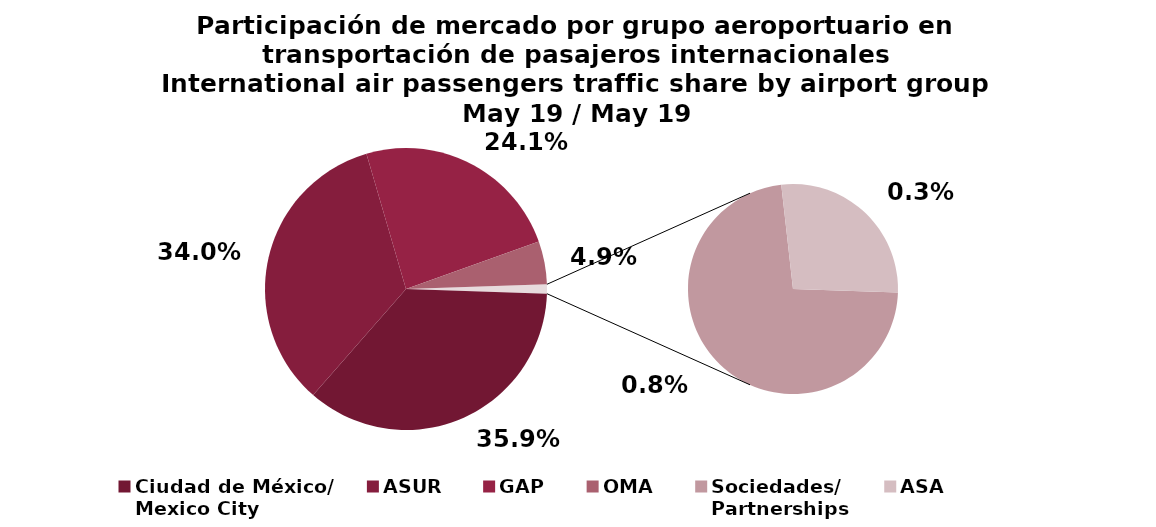
| Category | Series 0 |
|---|---|
| Ciudad de México/
Mexico City | 1458.486 |
| ASUR | 1382.146 |
| GAP | 977.325 |
| OMA | 200.498 |
| Sociedades/
Partnerships | 31.269 |
| ASA | 11.75 |